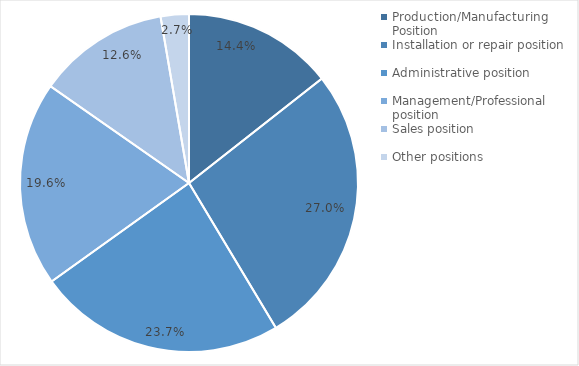
| Category | Occupational Distribution |
|---|---|
| Production/Manufacturing Position | 0.144 |
| Installation or repair position | 0.27 |
| Administrative position | 0.237 |
| Management/Professional position | 0.196 |
| Sales position | 0.126 |
| Other positions  | 0.027 |